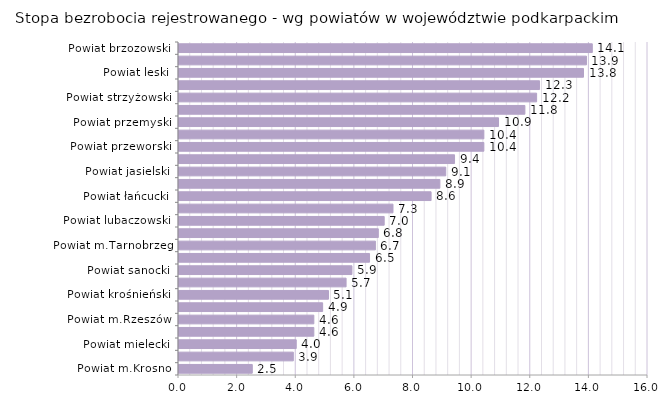
| Category | Stopa bezrobocia rejestrowanego - wg powiatów w województwie podkarpackim |
|---|---|
| Powiat m.Krosno | 2.5 |
| Powiat dębicki | 3.9 |
| Powiat mielecki | 4 |
| Powiat stalowowolski | 4.6 |
| Powiat m.Rzeszów | 4.6 |
| POLSKA | 4.9 |
| Powiat krośnieński | 5.1 |
| Powiat tarnobrzeski | 5.7 |
| Powiat sanocki | 5.9 |
| Powiat rzeszowski | 6.5 |
| Powiat m.Tarnobrzeg | 6.7 |
| Powiat kolbuszowski | 6.8 |
| Powiat lubaczowski | 7 |
| PODKARPACKIE | 7.3 |
| Powiat łańcucki | 8.6 |
| Powiat jarosławski | 8.9 |
| Powiat jasielski | 9.1 |
| Powiat m.Przemyśl | 9.4 |
| Powiat przeworski | 10.4 |
| Powiat ropczycko-sędziszowski | 10.4 |
| Powiat przemyski | 10.9 |
| Powiat leżajski | 11.8 |
| Powiat strzyżowski | 12.2 |
| Powiat bieszczadzki | 12.3 |
| Powiat leski | 13.8 |
| Powiat niżański | 13.9 |
| Powiat brzozowski | 14.1 |